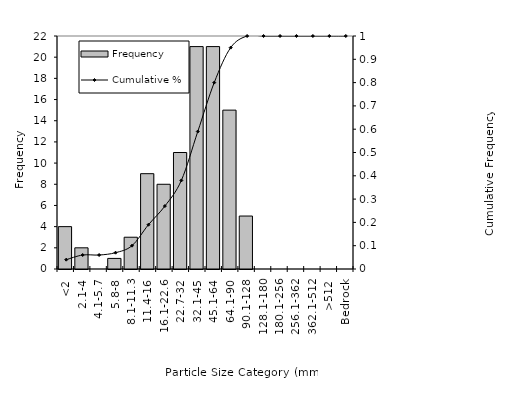
| Category | Frequency |
|---|---|
| <2 | 4 |
| 2.1-4 | 2 |
| 4.1-5.7 | 0 |
| 5.8-8 | 1 |
| 8.1-11.3 | 3 |
| 11.4-16 | 9 |
| 16.1-22.6 | 8 |
| 22.7-32 | 11 |
| 32.1-45 | 21 |
| 45.1-64 | 21 |
| 64.1-90 | 15 |
| 90.1-128 | 5 |
| 128.1-180 | 0 |
| 180.1-256 | 0 |
| 256.1-362 | 0 |
| 362.1-512 | 0 |
| >512 | 0 |
| Bedrock | 0 |